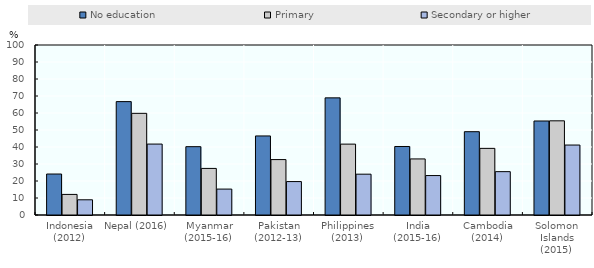
| Category | No education | Primary | Secondary or higher |
|---|---|---|---|
| Indonesia (2012) | 24.1 | 12.108 | 8.943 |
| Nepal (2016) | 66.7 | 59.8 | 41.728 |
| Myanmar (2015-16) | 40.2 | 27.4 | 15.247 |
| Pakistan (2012-13) | 46.5 | 32.6 | 19.664 |
| Philippines (2013) | 68.9 | 41.7 | 24.011 |
| India (2015-16) | 40.3 | 32.98 | 23.206 |
| Cambodia (2014) | 49 | 39.2 | 25.5 |
| Solomon Islands (2015) | 55.3 | 55.4 | 41.156 |